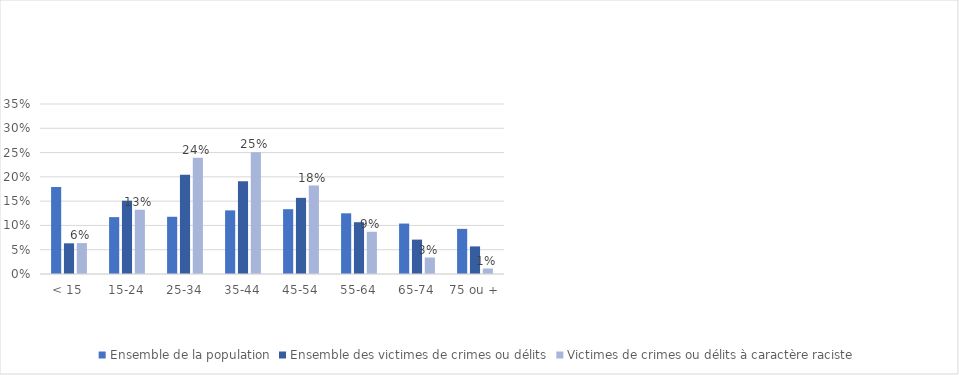
| Category | Ensemble de la population | Ensemble des victimes de crimes ou délits | Victimes de crimes ou délits à caractère raciste |
|---|---|---|---|
| < 15 | 0.179 | 0.063 | 0.064 |
| 15-24 | 0.117 | 0.151 | 0.132 |
| 25-34 | 0.118 | 0.204 | 0.239 |
| 35-44 | 0.131 | 0.191 | 0.25 |
| 45-54 | 0.133 | 0.157 | 0.182 |
| 55-64 | 0.125 | 0.107 | 0.087 |
| 65-74 | 0.104 | 0.071 | 0.034 |
| 75 ou + | 0.093 | 0.057 | 0.011 |